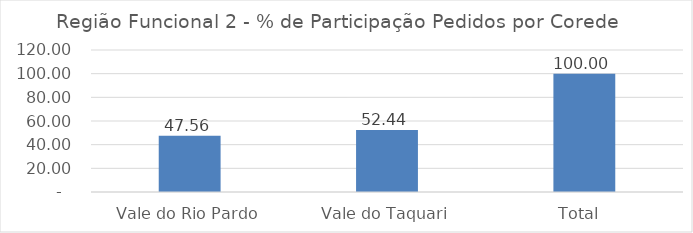
| Category | Series 0 |
|---|---|
| Vale do Rio Pardo | 47.561 |
| Vale do Taquari | 52.439 |
| Total  | 100 |